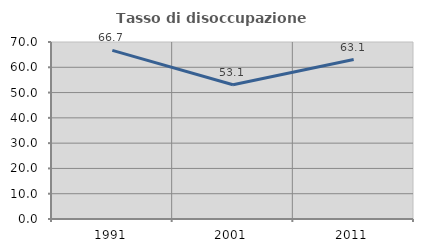
| Category | Tasso di disoccupazione giovanile  |
|---|---|
| 1991.0 | 66.667 |
| 2001.0 | 53.086 |
| 2011.0 | 63.077 |